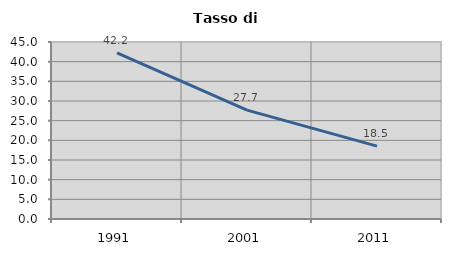
| Category | Tasso di disoccupazione   |
|---|---|
| 1991.0 | 42.222 |
| 2001.0 | 27.69 |
| 2011.0 | 18.532 |